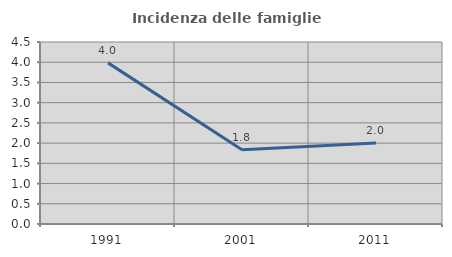
| Category | Incidenza delle famiglie numerose |
|---|---|
| 1991.0 | 3.984 |
| 2001.0 | 1.838 |
| 2011.0 | 2.005 |